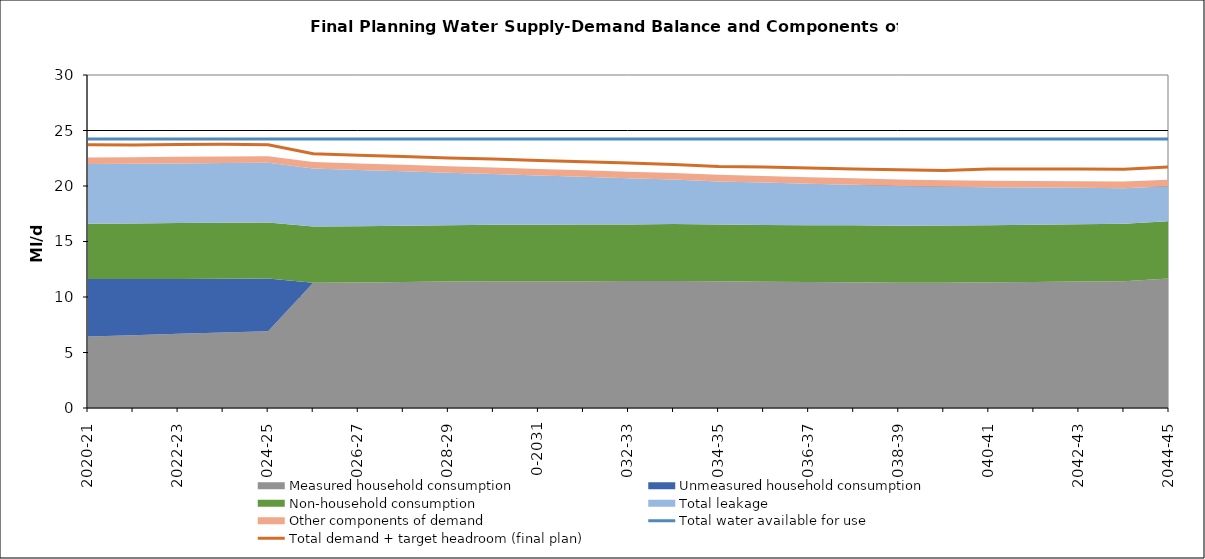
| Category | Total water available for use | Total demand + target headroom (final plan) |
|---|---|---|
| 0 | 24.24 | 23.706 |
| 1 | 24.24 | 23.703 |
| 2 | 24.24 | 23.742 |
| 3 | 24.24 | 23.754 |
| 4 | 24.24 | 23.721 |
| 5 | 24.24 | 22.913 |
| 6 | 24.24 | 22.773 |
| 7 | 24.24 | 22.653 |
| 8 | 24.24 | 22.518 |
| 9 | 24.24 | 22.422 |
| 10 | 24.24 | 22.297 |
| 11 | 24.24 | 22.176 |
| 12 | 24.24 | 22.062 |
| 13 | 24.24 | 21.933 |
| 14 | 24.24 | 21.767 |
| 15 | 24.24 | 21.709 |
| 16 | 24.24 | 21.63 |
| 17 | 24.24 | 21.534 |
| 18 | 24.24 | 21.464 |
| 19 | 24.24 | 21.399 |
| 20 | 24.24 | 21.53 |
| 21 | 24.24 | 21.534 |
| 22 | 24.24 | 21.531 |
| 23 | 24.24 | 21.51 |
| 24 | 24.24 | 21.716 |